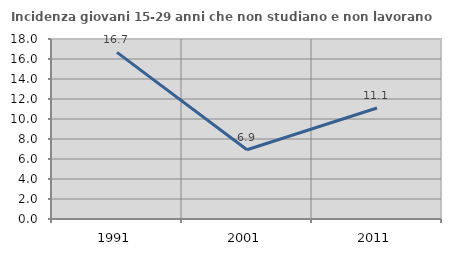
| Category | Incidenza giovani 15-29 anni che non studiano e non lavorano  |
|---|---|
| 1991.0 | 16.667 |
| 2001.0 | 6.92 |
| 2011.0 | 11.101 |